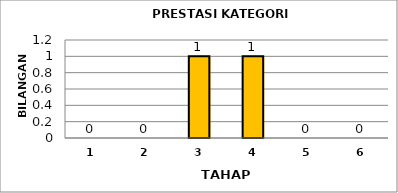
| Category | Series 0 |
|---|---|
| 1.0 | 0 |
| 2.0 | 0 |
| 3.0 | 1 |
| 4.0 | 1 |
| 5.0 | 0 |
| 6.0 | 0 |